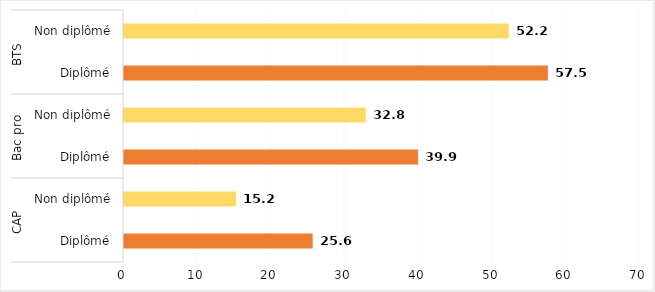
| Category | Series 0 |
|---|---|
| 0 | 25.6 |
| 1 | 15.2 |
| 2 | 39.9 |
| 3 | 32.8 |
| 4 | 57.5 |
| 5 | 52.2 |